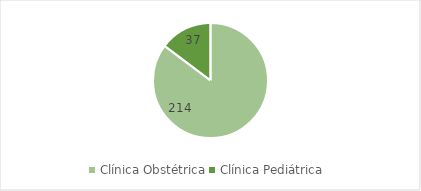
| Category | Series 0 |
|---|---|
| Clínica Obstétrica | 214 |
| Clínica Pediátrica  | 37 |